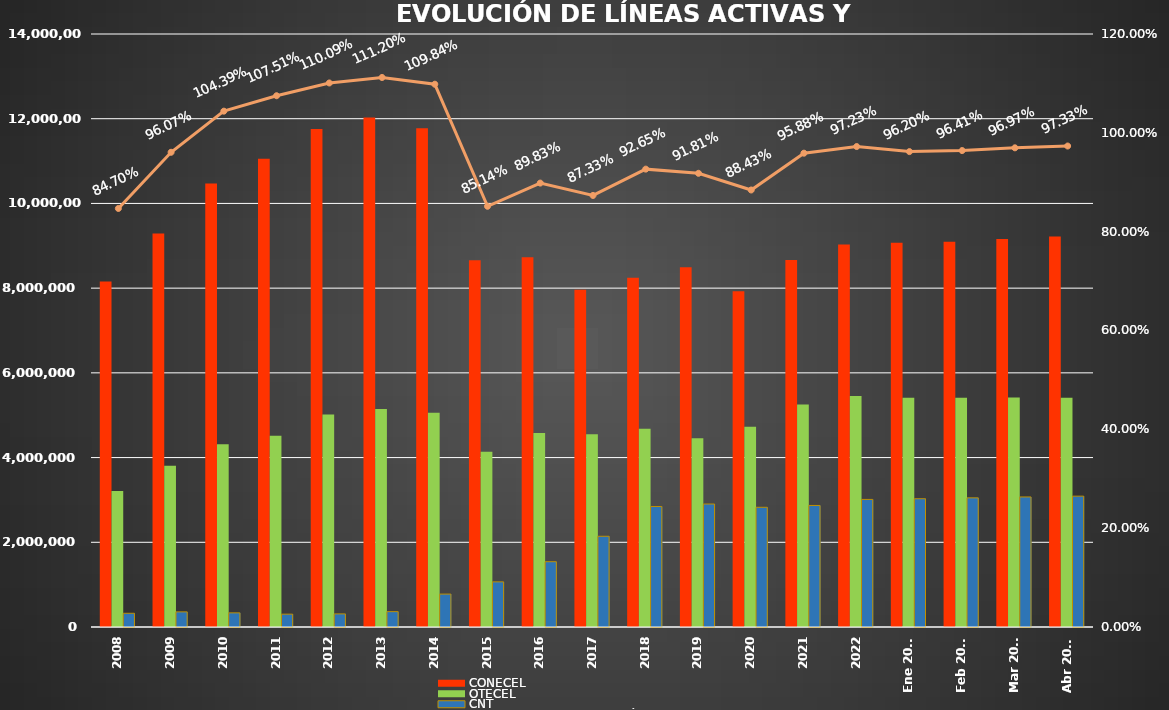
| Category | CONECEL | OTECEL | CNT |
|---|---|---|---|
| 2008 | 8156359 | 3211922 | 323967 |
| 2009 | 9291268 | 3806432 | 356900 |
| 2010 | 10470502 | 4314599 | 333730 |
| 2011 | 11057316 | 4513874 | 303368 |
| 2012 | 11757906 | 5019686 | 309271 |
| 2013 | 12030886 | 5148308 | 362560 |
| 2014 | 11772020 | 5055645 | 776892 |
| 2015 | 8658619 | 4134698 | 1065703 |
| 2016 | 8726823 | 4580092 | 1541219 |
| 2017 | 7960263 | 4549024 | 2142117 |
| 2018 | 8248050 | 4679646 | 2845142 |
| 2019 | 8493054 | 4456356 | 2903690 |
| 2020 | 7929253 | 4729725 | 2826388 |
| 2021 | 8665715 | 5254468 | 2869417 |
| 2022 | 9027737 | 5451115 | 3011899 |
| Ene 2023 | 9073421 | 5411860 | 3028254 |
| Feb 2023 | 9092490 | 5410682 | 3048837 |
| Mar 2023 | 9162562 | 5419670 | 3070611 |
| Abr 2023 | 9220042 | 5409581 | 3089410 |